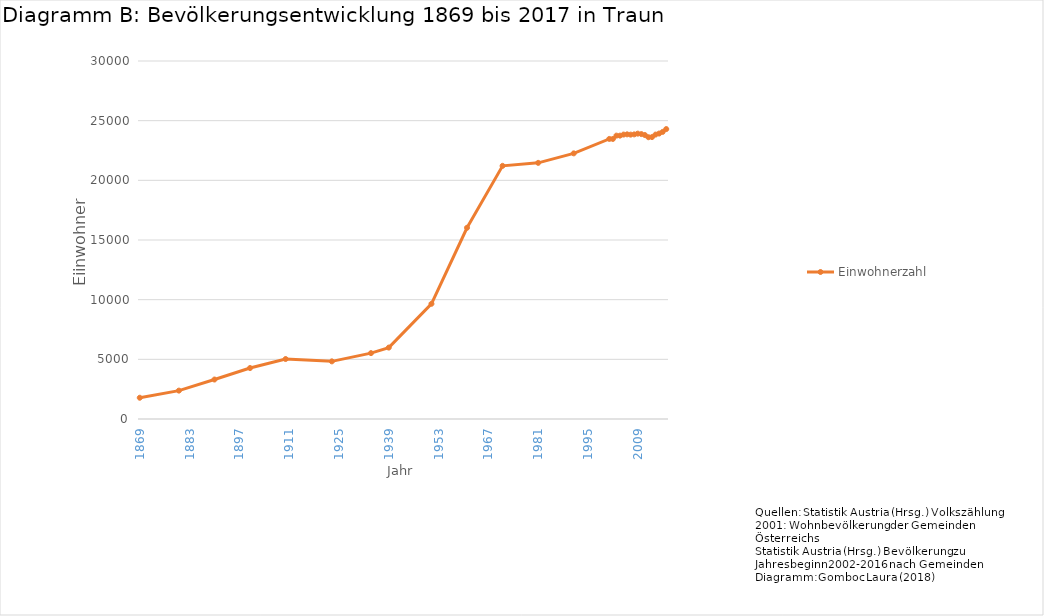
| Category | Einwohnerzahl |
|---|---|
| 1869.0 | 1781 |
| 1880.0 | 2378 |
| 1890.0 | 3308 |
| 1900.0 | 4271 |
| 1910.0 | 5026 |
| 1923.0 | 4830 |
| 1934.0 | 5521 |
| 1939.0 | 5985 |
| 1951.0 | 9655 |
| 1961.0 | 16026 |
| 1971.0 | 21215 |
| 1981.0 | 21464 |
| 1991.0 | 22260 |
| 2001.0 | 23470 |
| 2002.0 | 23466 |
| 2003.0 | 23746 |
| 2004.0 | 23746 |
| 2005.0 | 23834 |
| 2006.0 | 23853 |
| 2007.0 | 23829 |
| 2008.0 | 23851 |
| 2009.0 | 23912 |
| 2010.0 | 23876 |
| 2011.0 | 23797 |
| 2012.0 | 23612 |
| 2013.0 | 23624 |
| 2014.0 | 23834 |
| 2015.0 | 23921 |
| 2016.0 | 24058 |
| 2017.0 | 24295 |